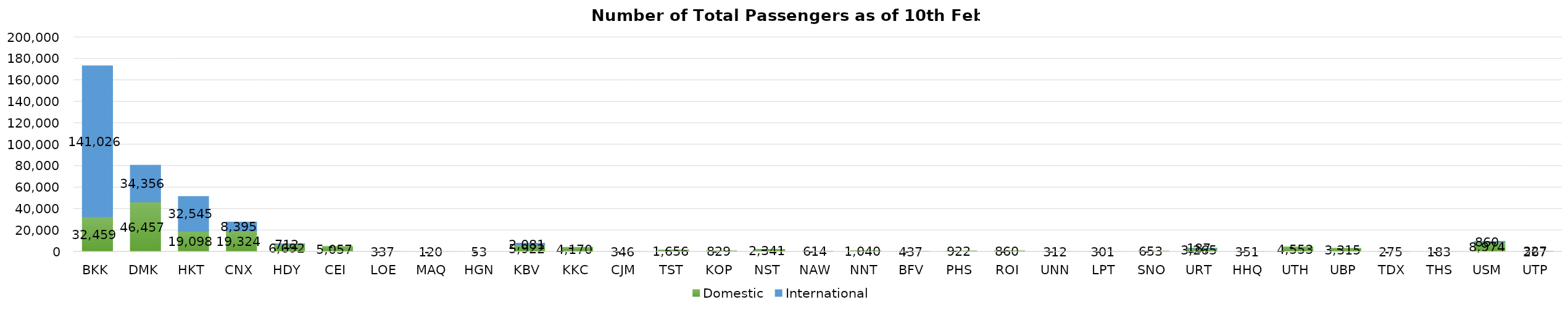
| Category | Domestic | International |
|---|---|---|
| BKK | 32459 | 141026 |
| DMK | 46457 | 34356 |
| HKT | 19098 | 32545 |
| CNX | 19324 | 8395 |
| HDY | 6692 | 712 |
| CEI | 5057 | 0 |
| LOE | 337 | 0 |
| MAQ | 120 | 0 |
| HGN | 53 | 0 |
| KBV | 5922 | 2081 |
| KKC | 4170 | 0 |
| CJM | 346 | 0 |
| TST | 1656 | 0 |
| KOP | 829 | 0 |
| NST | 2341 | 0 |
| NAW | 614 | 0 |
| NNT | 1040 | 0 |
| BFV | 437 | 0 |
| PHS | 922 | 0 |
| ROI | 860 | 0 |
| UNN | 312 | 0 |
| LPT | 301 | 0 |
| SNO | 653 | 0 |
| URT | 3265 | 187 |
| HHQ | 351 | 0 |
| UTH | 4553 | 0 |
| UBP | 3315 | 0 |
| TDX | 275 | 0 |
| THS | 183 | 0 |
| USM | 8974 | 860 |
| UTP | 267 | 327 |